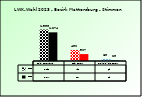
| Category | 2018 | 2023 |
|---|---|---|
| Bgld. Bauernbund | 1398 | 1274 |
| SPÖ Bauern | 490 | 307 |
| Freiheitliche Bauern | 69 | 29 |